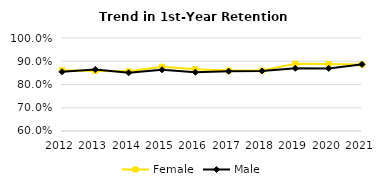
| Category | Female | Male |
|---|---|---|
| 2012.0 | 0.861 | 0.855 |
| 2013.0 | 0.858 | 0.864 |
| 2014.0 | 0.857 | 0.85 |
| 2015.0 | 0.876 | 0.863 |
| 2016.0 | 0.866 | 0.853 |
| 2017.0 | 0.86 | 0.857 |
| 2018.0 | 0.86 | 0.858 |
| 2019.0 | 0.89 | 0.87 |
| 2020.0 | 0.888 | 0.869 |
| 2021.0 | 0.886 | 0.887 |